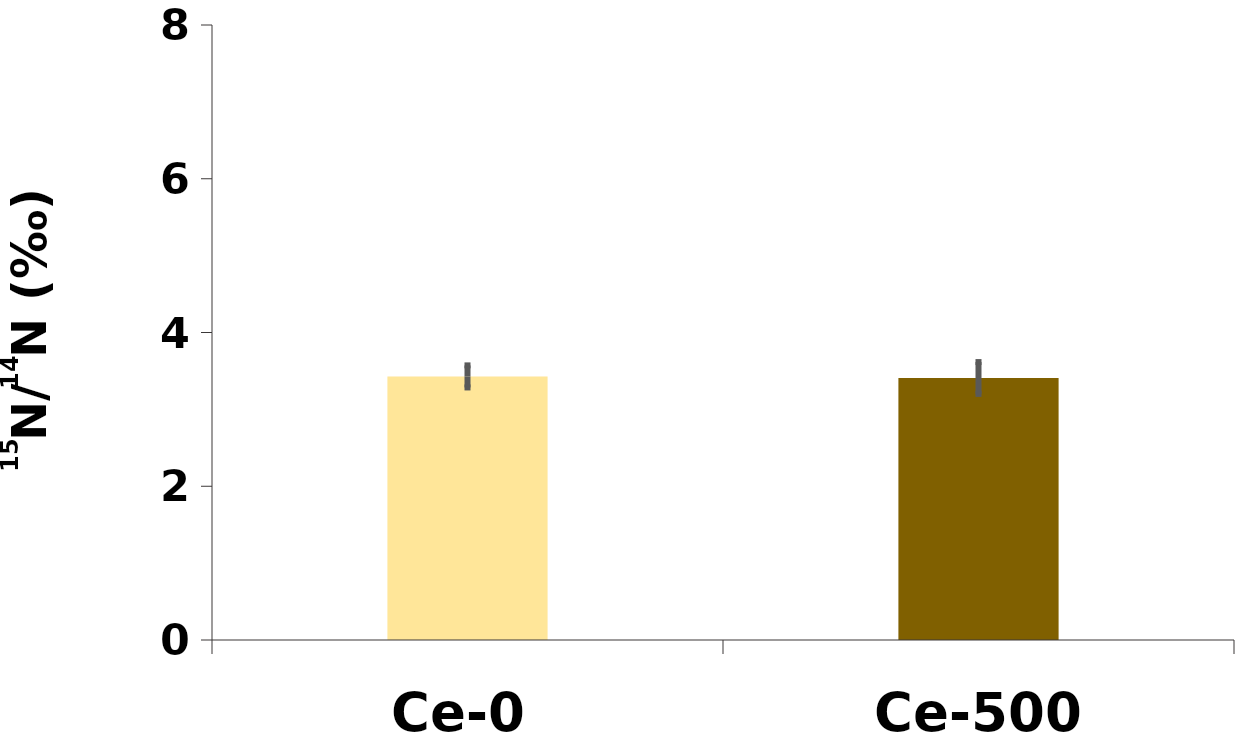
| Category | δ15N |
|---|---|
| Ce-0 | 3.429 |
| Ce-500 | 3.408 |